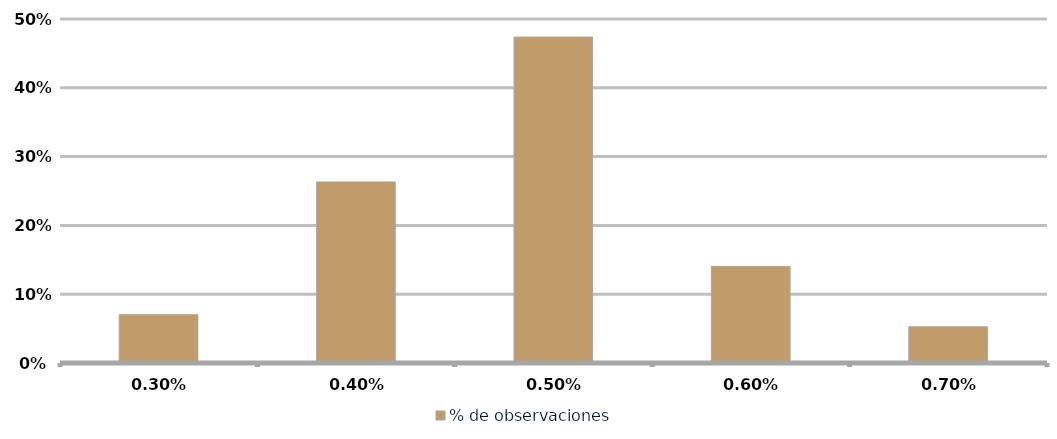
| Category | % de observaciones  |
|---|---|
| 0.003 | 0.07 |
| 0.004 | 0.263 |
| 0.005 | 0.474 |
| 0.006 | 0.14 |
| 0.007 | 0.053 |